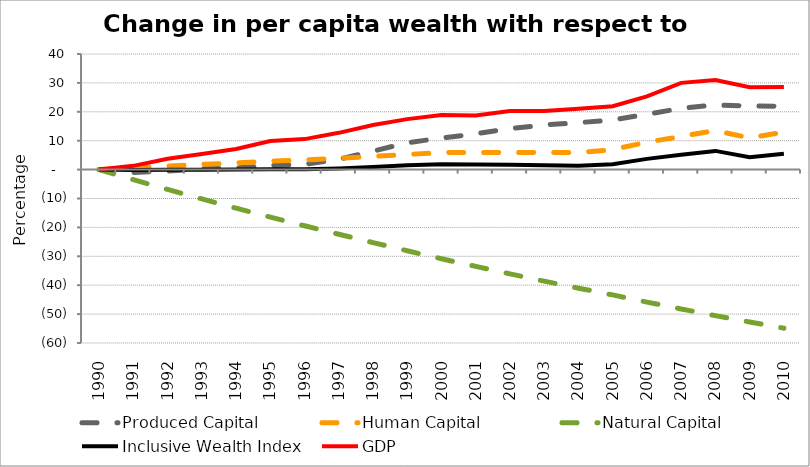
| Category | Produced Capital  | Human Capital | Natural Capital | Inclusive Wealth Index | GDP |
|---|---|---|---|---|---|
| 1990.0 | 0 | 0 | 0 | 0 | 0 |
| 1991.0 | -0.971 | 0.676 | -3.472 | -0.116 | 1.297 |
| 1992.0 | -0.496 | 1.25 | -6.852 | -0.075 | 3.766 |
| 1993.0 | 0.241 | 1.774 | -10.149 | -0.018 | 5.368 |
| 1994.0 | 0.607 | 2.323 | -13.345 | 0.013 | 7.112 |
| 1995.0 | 1.373 | 2.926 | -16.438 | 0.157 | 9.866 |
| 1996.0 | 1.813 | 3.351 | -19.444 | 0.136 | 10.552 |
| 1997.0 | 3.561 | 3.916 | -22.368 | 0.423 | 12.719 |
| 1998.0 | 6.375 | 4.568 | -25.266 | 0.938 | 15.433 |
| 1999.0 | 9.29 | 5.233 | -28.094 | 1.486 | 17.466 |
| 2000.0 | 10.933 | 5.88 | -30.851 | 1.839 | 18.859 |
| 2001.0 | 12.366 | 5.921 | -33.501 | 1.739 | 18.719 |
| 2002.0 | 14.216 | 5.916 | -36.075 | 1.678 | 20.303 |
| 2003.0 | 15.426 | 5.898 | -38.603 | 1.518 | 20.307 |
| 2004.0 | 16.248 | 5.918 | -41.034 | 1.338 | 21.036 |
| 2005.0 | 17.172 | 6.906 | -43.361 | 1.883 | 21.912 |
| 2006.0 | 19.13 | 9.498 | -45.852 | 3.714 | 25.339 |
| 2007.0 | 21.205 | 11.464 | -48.233 | 5.128 | 30.009 |
| 2008.0 | 22.369 | 13.507 | -50.528 | 6.471 | 31.019 |
| 2009.0 | 22.021 | 10.953 | -52.742 | 4.295 | 28.518 |
| 2010.0 | 21.906 | 12.985 | -54.881 | 5.456 | 28.612 |